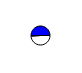
| Category | Series 0 |
|---|---|
| 0 | 13096 |
| 1 | 13652 |